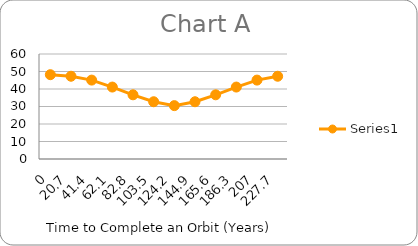
| Category | Series 0 |
|---|---|
| 0.0 | 48.178 |
| 20.7 | 47.294 |
| 41.4 | 45.084 |
| 62.099999999999994 | 41.106 |
| 82.8 | 36.686 |
| 103.5 | 32.708 |
| 124.19999999999999 | 30.498 |
| 144.9 | 32.708 |
| 165.6 | 36.686 |
| 186.29999999999998 | 41.106 |
| 207.0 | 45.084 |
| 227.7 | 47.294 |